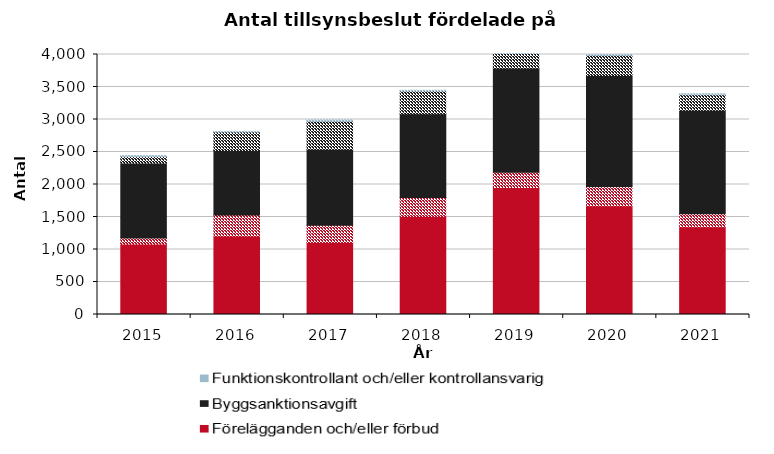
| Category | Förelägganden och/eller förbud | Uppräkning | Byggsanktionsavgift | Funktionskontrollant och/eller kontrollansvarig |
|---|---|---|---|---|
| 2015 | 1086 | 0.964 | 1154 | 12 |
| 2016 | 1208 | 2.175 | 994 | 9 |
| 2017 | 1109 | 3 | 1170 | 13 |
| 2018 | 1509 | 3 | 1289 | 8 |
| 2019 | 1953 | 3 | 1605 | 10 |
| 2020 | 1673 | 2 | 1705 | 15 |
| 2021 | 1351 | 2 | 1592 | 9 |